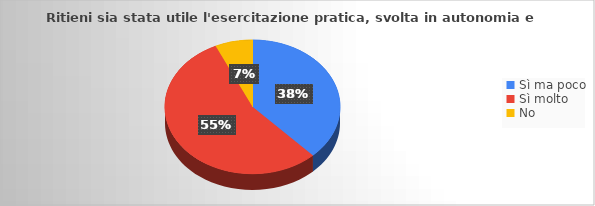
| Category | Series 0 |
|---|---|
| Sì ma poco | 22 |
| Sì molto | 32 |
| No | 4 |